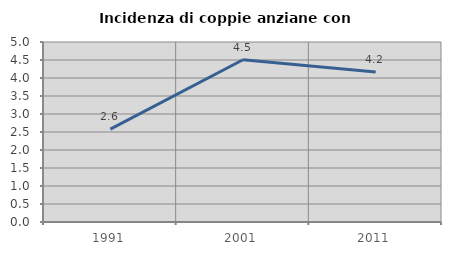
| Category | Incidenza di coppie anziane con figli |
|---|---|
| 1991.0 | 2.579 |
| 2001.0 | 4.506 |
| 2011.0 | 4.165 |